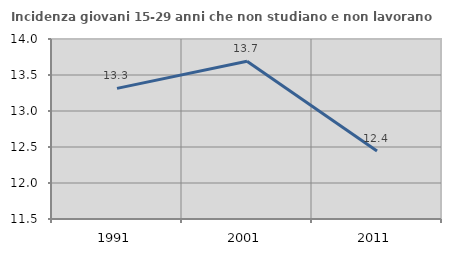
| Category | Incidenza giovani 15-29 anni che non studiano e non lavorano  |
|---|---|
| 1991.0 | 13.314 |
| 2001.0 | 13.692 |
| 2011.0 | 12.444 |